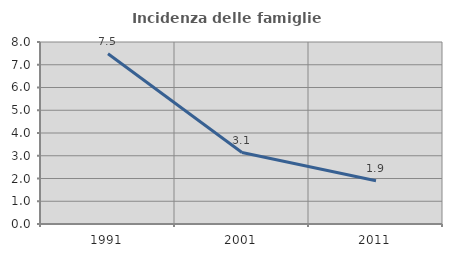
| Category | Incidenza delle famiglie numerose |
|---|---|
| 1991.0 | 7.485 |
| 2001.0 | 3.141 |
| 2011.0 | 1.9 |